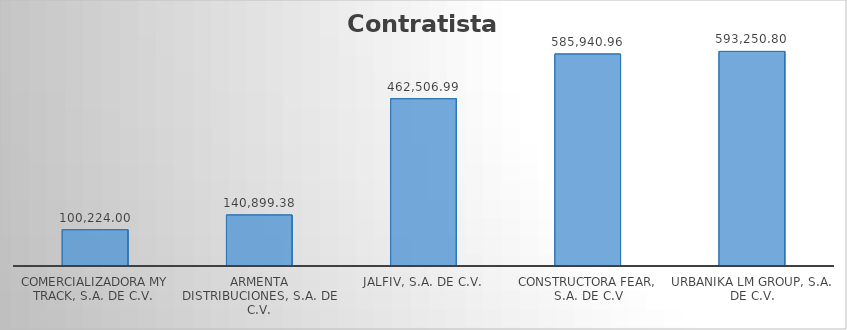
| Category | Monto total  |
|---|---|
| COMERCIALIZADORA MY TRACK, S.A. DE C.V.  | 100224 |
| ARMENTA DISTRIBUCIONES, S.A. DE C.V. | 140899.38 |
| JALFIV, S.A. DE C.V. | 462506.99 |
| CONSTRUCTORA FEAR, S.A. DE C.V | 585940.96 |
| URBANIKA LM GROUP, S.A. DE C.V. | 593250.8 |